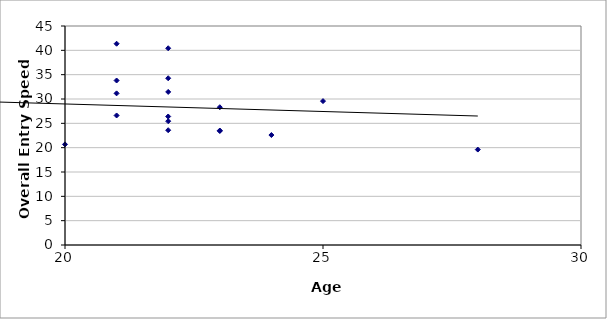
| Category | Series 0 |
|---|---|
| 21.0 | 31.156 |
| 20.0 | 20.679 |
| 23.0 | 23.518 |
| 21.0 | 41.356 |
| 22.0 | 26.406 |
| 22.0 | 23.586 |
| 22.0 | 25.44 |
| 28.0 | 19.61 |
| 22.0 | 40.428 |
| 0.0 | 32.638 |
| 23.0 | 23.417 |
| 23.0 | 28.308 |
| 21.0 | 33.8 |
| 25.0 | 29.57 |
| 21.0 | 26.615 |
| 24.0 | 22.595 |
| 22.0 | 34.265 |
| 22.0 | 31.454 |